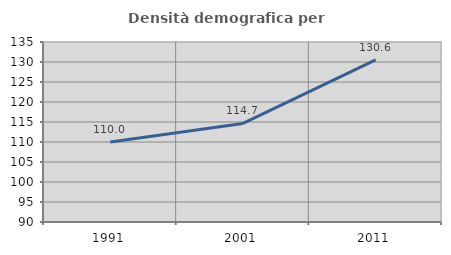
| Category | Densità demografica |
|---|---|
| 1991.0 | 109.989 |
| 2001.0 | 114.65 |
| 2011.0 | 130.554 |